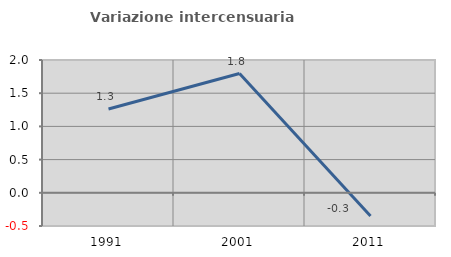
| Category | Variazione intercensuaria annua |
|---|---|
| 1991.0 | 1.263 |
| 2001.0 | 1.796 |
| 2011.0 | -0.349 |